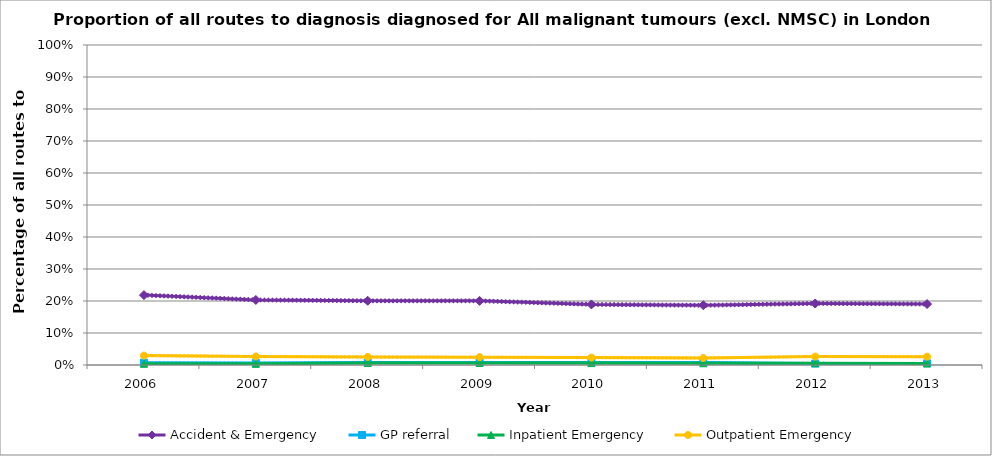
| Category | Accident & Emergency | Series 1 | Series 2 | GP referral | Series 4 | Series 5 | Inpatient Emergency | Series 7 | Series 8 | Outpatient Emergency | Series 10 | Series 11 |
|---|---|---|---|---|---|---|---|---|---|---|---|---|
| 2006.0 | 0.218 | 0.214 | 0.223 | 0.007 | 0.006 | 0.008 | 0.004 | 0.003 | 0.004 | 0.029 | 0.027 | 0.031 |
| 2007.0 | 0.203 | 0.199 | 0.208 | 0.006 | 0.005 | 0.007 | 0.004 | 0.003 | 0.004 | 0.026 | 0.025 | 0.028 |
| 2008.0 | 0.201 | 0.196 | 0.205 | 0.008 | 0.007 | 0.009 | 0.006 | 0.006 | 0.007 | 0.025 | 0.023 | 0.027 |
| 2009.0 | 0.2 | 0.196 | 0.205 | 0.008 | 0.007 | 0.009 | 0.007 | 0.006 | 0.007 | 0.025 | 0.023 | 0.026 |
| 2010.0 | 0.189 | 0.185 | 0.194 | 0.008 | 0.007 | 0.009 | 0.006 | 0.005 | 0.007 | 0.023 | 0.021 | 0.025 |
| 2011.0 | 0.187 | 0.182 | 0.191 | 0.008 | 0.007 | 0.009 | 0.005 | 0.005 | 0.006 | 0.022 | 0.02 | 0.024 |
| 2012.0 | 0.192 | 0.188 | 0.197 | 0.004 | 0.004 | 0.005 | 0.006 | 0.005 | 0.007 | 0.026 | 0.025 | 0.028 |
| 2013.0 | 0.19 | 0.186 | 0.195 | 0.005 | 0.004 | 0.006 | 0.005 | 0.004 | 0.006 | 0.026 | 0.024 | 0.028 |